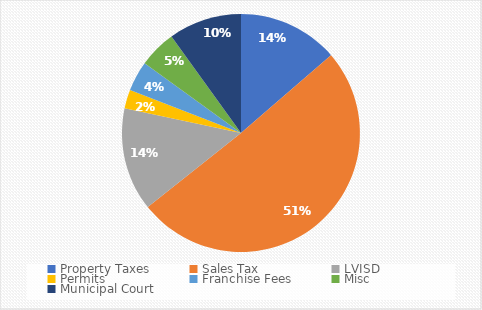
| Category | Series 0 |
|---|---|
| Property Taxes | 233387 |
| Sales Tax | 866500 |
| LVISD | 239328.499 |
| Permits | 43800 |
| Franchise Fees | 70000 |
| Misc | 87112.001 |
| Municipal Court | 169820 |